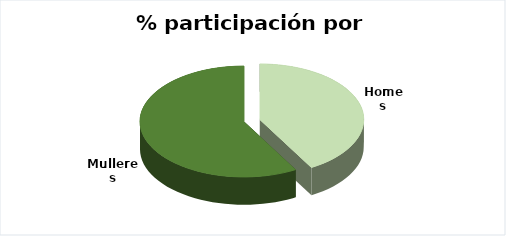
| Category | Series 0 |
|---|---|
| Homes | 214 |
| Mulleres | 299 |